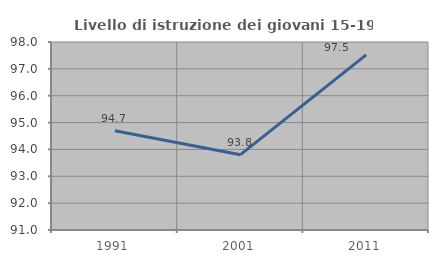
| Category | Livello di istruzione dei giovani 15-19 anni |
|---|---|
| 1991.0 | 94.697 |
| 2001.0 | 93.805 |
| 2011.0 | 97.521 |